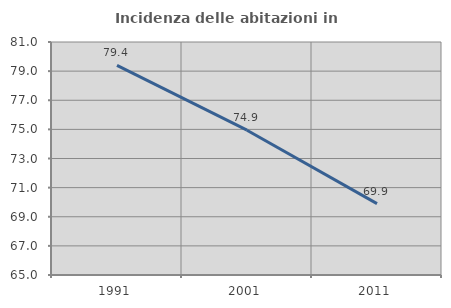
| Category | Incidenza delle abitazioni in proprietà  |
|---|---|
| 1991.0 | 79.398 |
| 2001.0 | 74.944 |
| 2011.0 | 69.901 |